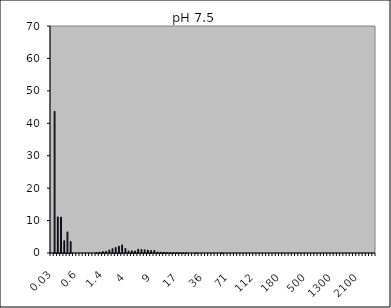
| Category | PC pH 7,5 1Nb |
|---|---|
| 0.03 | 0 |
| 0.04 | 43.69 |
| 0.07 | 11.127 |
| 0.1 | 11.084 |
| 0.2 | 3.783 |
| 0.3 | 6.497 |
| 0.4 | 3.557 |
| 0.5 | 0 |
| 0.6 | 0 |
| 0.7 | 0 |
| 0.8 | 0 |
| 0.9 | 0 |
| 1.0 | 0 |
| 1.1 | 0 |
| 1.2 | 0.107 |
| 1.3 | 0.272 |
| 1.4 | 0.462 |
| 1.6 | 0.489 |
| 1.8 | 0.924 |
| 2.0 | 1.328 |
| 2.2 | 1.73 |
| 2.4 | 2.109 |
| 2.6 | 2.487 |
| 3.0 | 1.391 |
| 4.0 | 0.627 |
| 5.0 | 0.669 |
| 6.0 | 0.614 |
| 6.5 | 1.166 |
| 7.0 | 1.049 |
| 7.5 | 0.992 |
| 8.0 | 0.867 |
| 8.5 | 0.77 |
| 9.0 | 0.762 |
| 10.0 | 0.295 |
| 11.0 | 0.228 |
| 12.0 | 0.214 |
| 13.0 | 0.155 |
| 14.0 | 0.126 |
| 15.0 | 0.09 |
| 16.0 | 0.096 |
| 17.0 | 0.051 |
| 18.0 | 0.054 |
| 19.0 | 0.058 |
| 20.0 | 0 |
| 22.0 | 0 |
| 25.0 | 0.024 |
| 28.0 | 0 |
| 32.0 | 0 |
| 36.0 | 0 |
| 38.0 | 0 |
| 40.0 | 0 |
| 45.0 | 0 |
| 50.0 | 0 |
| 53.0 | 0.053 |
| 56.0 | 0 |
| 63.0 | 0 |
| 71.0 | 0 |
| 75.0 | 0 |
| 80.0 | 0 |
| 85.0 | 0 |
| 90.0 | 0 |
| 95.0 | 0 |
| 100.0 | 0 |
| 106.0 | 0 |
| 112.0 | 0 |
| 125.0 | 0 |
| 130.0 | 0 |
| 140.0 | 0 |
| 145.0 | 0 |
| 150.0 | 0 |
| 160.0 | 0 |
| 170.0 | 0 |
| 180.0 | 0 |
| 190.0 | 0 |
| 200.0 | 0 |
| 212.0 | 0 |
| 242.0 | 0 |
| 250.0 | 0 |
| 300.0 | 0 |
| 400.0 | 0 |
| 500.0 | 0 |
| 600.0 | 0 |
| 700.0 | 0 |
| 800.0 | 0 |
| 900.0 | 0 |
| 1000.0 | 0 |
| 1100.0 | 0 |
| 1200.0 | 0 |
| 1300.0 | 0 |
| 1400.0 | 0 |
| 1500.0 | 0 |
| 1600.0 | 0 |
| 1700.0 | 0 |
| 1800.0 | 0 |
| 1900.0 | 0 |
| 2000.0 | 0 |
| 2100.0 | 0 |
| 2200.0 | 0 |
| 2300.0 | 0 |
| 2400.0 | 0 |
| 2500.0 | 0 |